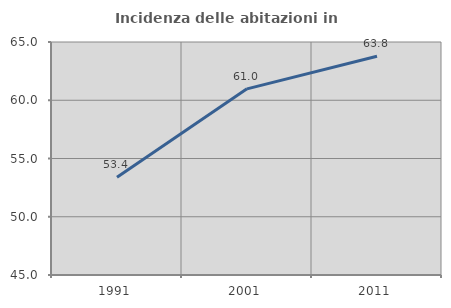
| Category | Incidenza delle abitazioni in proprietà  |
|---|---|
| 1991.0 | 53.383 |
| 2001.0 | 60.978 |
| 2011.0 | 63.783 |